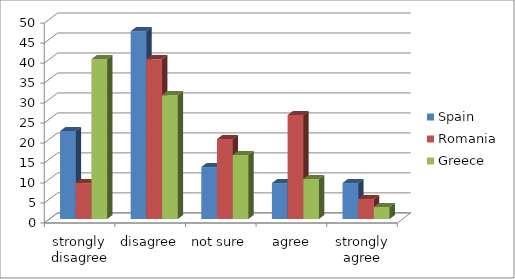
| Category | Spain | Romania | Greece |
|---|---|---|---|
| strongly disagree | 22 | 9 | 40 |
| disagree | 47 | 40 | 31 |
| not sure | 13 | 20 | 16 |
|  agree | 9 | 26 | 10 |
| strongly agree | 9 | 5 | 3 |